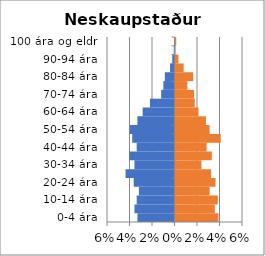
| Category | % karlar | %konur |
|---|---|---|
| 0-4 ára | -0.033 | 0.038 |
| 5-9 ára | -0.036 | 0.035 |
| 10-14 ára | -0.034 | 0.038 |
| 15-19 ára | -0.032 | 0.03 |
| 20-24 ára | -0.036 | 0.036 |
| 25-29 ára | -0.044 | 0.032 |
| 30-34 ára | -0.036 | 0.023 |
| 35-39 ára | -0.04 | 0.032 |
| 40-44 ára | -0.034 | 0.028 |
| 45-49 ára | -0.038 | 0.04 |
| 50-54 ára | -0.04 | 0.03 |
| 55-59 ára | -0.033 | 0.027 |
| 60-64 ára | -0.028 | 0.02 |
| 65-69 ára | -0.022 | 0.017 |
| 70-74 ára | -0.012 | 0.016 |
| 75-79 ára | -0.01 | 0.011 |
| 80-84 ára | -0.009 | 0.016 |
| 85-89 ára | -0.004 | 0.007 |
| 90-94 ára | -0.002 | 0.003 |
| 95-99 ára | -0.001 | 0 |
| 100 ára og eldri | 0 | 0.001 |